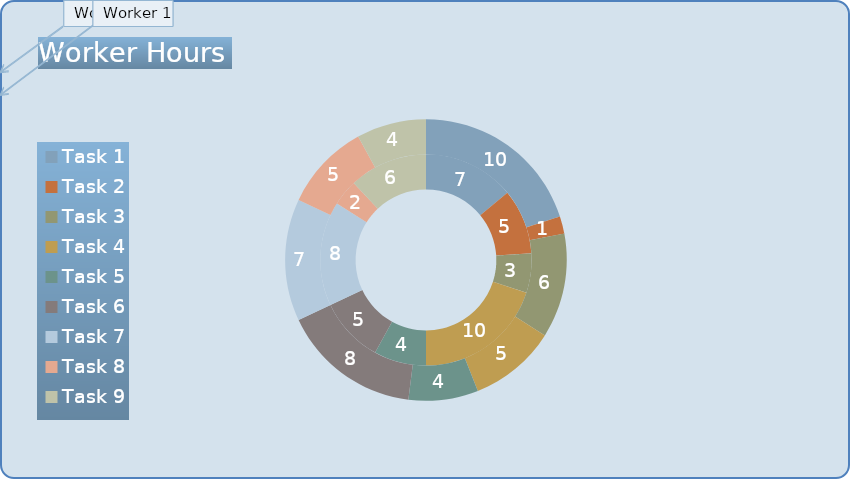
| Category | Worker 1 (hrs.) | Worker 2 (hrs.) |
|---|---|---|
| Task 1 | 7 | 10 |
| Task 2 | 5 | 1 |
| Task 3 | 3 | 6 |
| Task 4 | 10 | 5 |
| Task 5 | 4 | 4 |
| Task 6 | 5 | 8 |
| Task 7 | 8 | 7 |
| Task 8 | 2 | 5 |
| Task 9 | 6 | 4 |